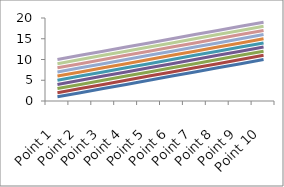
| Category | Series 1 | Series 2 | Series 3 | Series 4 | Series 5 | Series 6 | Series 7 | Series 8 | Series 9 | Series 10 |
|---|---|---|---|---|---|---|---|---|---|---|
| Point 1 | 1 | 2 | 3 | 4 | 5 | 6 | 7 | 8 | 9 | 10 |
| Point 2 | 2 | 3 | 4 | 5 | 6 | 7 | 8 | 9 | 10 | 11 |
| Point 3 | 3 | 4 | 5 | 6 | 7 | 8 | 9 | 10 | 11 | 12 |
| Point 4 | 4 | 5 | 6 | 7 | 8 | 9 | 10 | 11 | 12 | 13 |
| Point 5 | 5 | 6 | 7 | 8 | 9 | 10 | 11 | 12 | 13 | 14 |
| Point 6 | 6 | 7 | 8 | 9 | 10 | 11 | 12 | 13 | 14 | 15 |
| Point 7 | 7 | 8 | 9 | 10 | 11 | 12 | 13 | 14 | 15 | 16 |
| Point 8 | 8 | 9 | 10 | 11 | 12 | 13 | 14 | 15 | 16 | 17 |
| Point 9 | 9 | 10 | 11 | 12 | 13 | 14 | 15 | 16 | 17 | 18 |
| Point 10 | 10 | 11 | 12 | 13 | 14 | 15 | 16 | 17 | 18 | 19 |